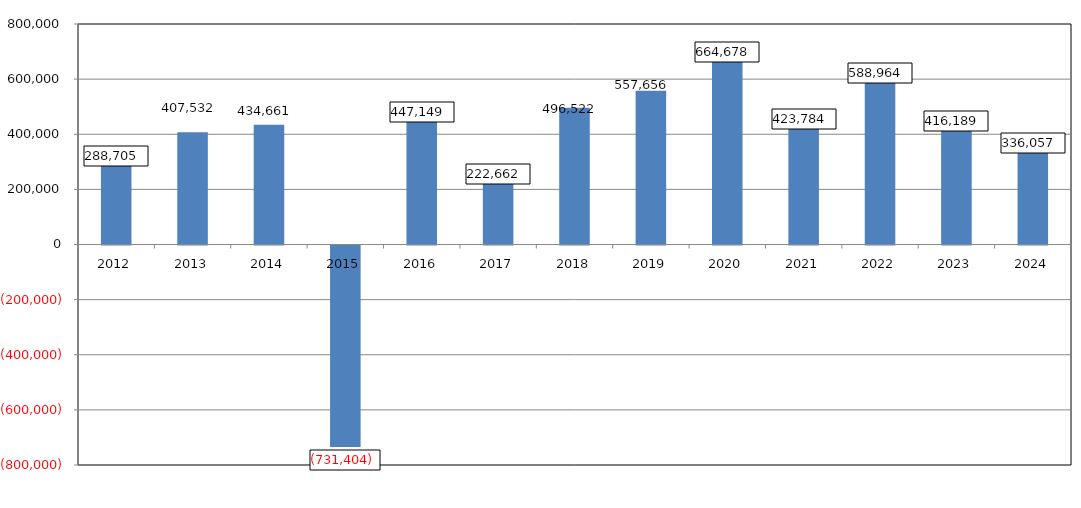
| Category | Series 0 |
|---|---|
| 2012.0 | 288705 |
| 2013.0 | 407532 |
| 2014.0 | 434661 |
| 2015.0 | -731404 |
| 2016.0 | 447149 |
| 2017.0 | 222662 |
| 2018.0 | 496522 |
| 2019.0 | 557656 |
| 2020.0 | 664678 |
| 2021.0 | 423784 |
| 2022.0 | 588964 |
| 2023.0 | 416189 |
| 2024.0 | 336057 |